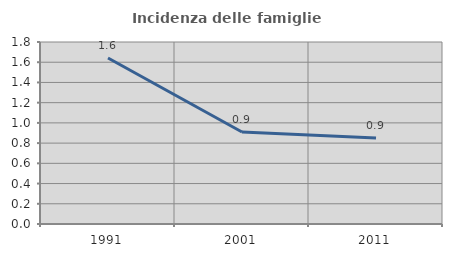
| Category | Incidenza delle famiglie numerose |
|---|---|
| 1991.0 | 1.642 |
| 2001.0 | 0.909 |
| 2011.0 | 0.851 |